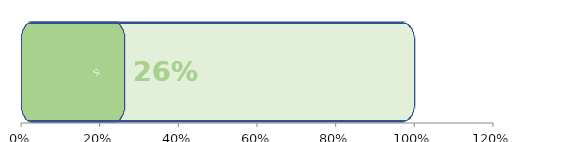
| Category | Series 1 | Serie1 |
|---|---|---|
| 0 | 1 | 0.262 |